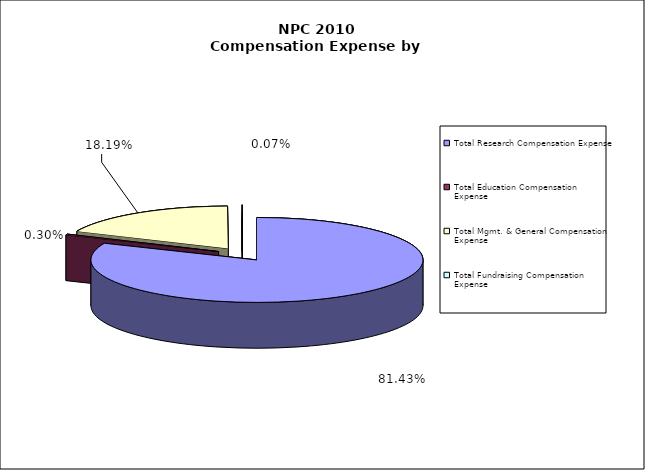
| Category | Series 0 |
|---|---|
| Total Research Compensation Expense | 117306160 |
| Total Education Compensation Expense | 430377 |
| Total Mgmt. & General Compensation Expense | 26209681 |
| Total Fundraising Compensation Expense | 104405 |